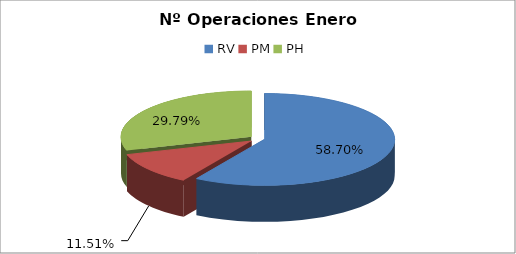
| Category | Series 0 |
|---|---|
| RV | 18515 |
| PM | 3629 |
| PH | 9396 |